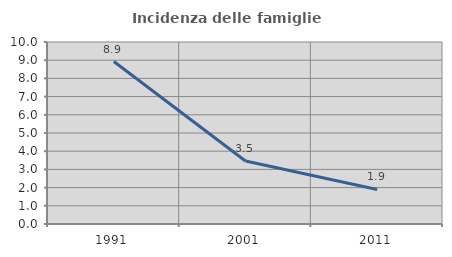
| Category | Incidenza delle famiglie numerose |
|---|---|
| 1991.0 | 8.929 |
| 2001.0 | 3.46 |
| 2011.0 | 1.899 |